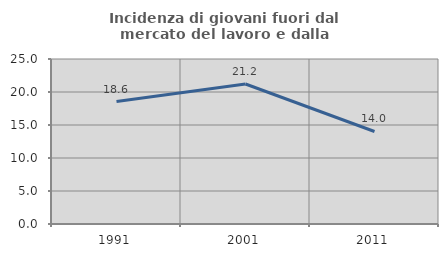
| Category | Incidenza di giovani fuori dal mercato del lavoro e dalla formazione  |
|---|---|
| 1991.0 | 18.557 |
| 2001.0 | 21.212 |
| 2011.0 | 14.019 |